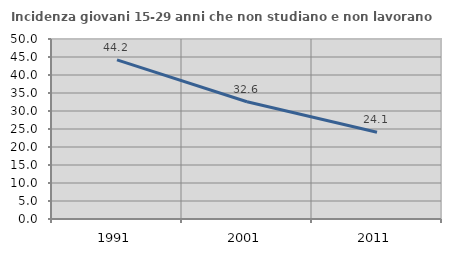
| Category | Incidenza giovani 15-29 anni che non studiano e non lavorano  |
|---|---|
| 1991.0 | 44.212 |
| 2001.0 | 32.576 |
| 2011.0 | 24.074 |